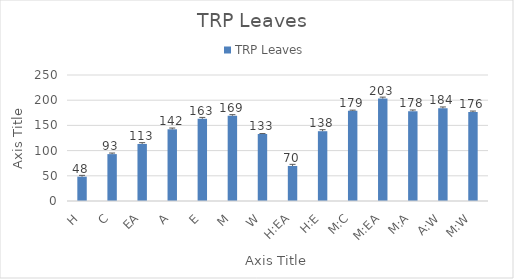
| Category | TRP Leaves  |
|---|---|
| H | 48.253 |
| C | 93.036 |
| EA | 113.204 |
| A | 142.256 |
| E | 163.188 |
| M | 169.16 |
| W | 132.922 |
| H:EA | 69.533 |
| H:E | 138.48 |
| M:C | 178.922 |
| M:EA | 203.271 |
| M:A | 178.316 |
| A:W | 183.824 |
| M:W | 176.347 |